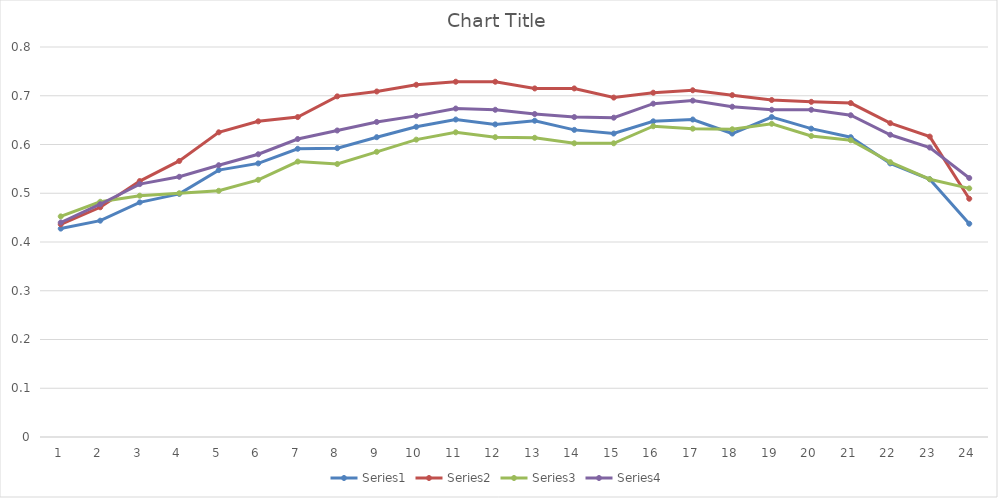
| Category | Series 0 | Series 1 | Series 2 | Series 3 |
|---|---|---|---|---|
| 0 | 0.428 | 0.436 | 0.452 | 0.44 |
| 1 | 0.444 | 0.471 | 0.483 | 0.478 |
| 2 | 0.481 | 0.525 | 0.495 | 0.519 |
| 3 | 0.499 | 0.566 | 0.5 | 0.534 |
| 4 | 0.548 | 0.625 | 0.505 | 0.558 |
| 5 | 0.561 | 0.648 | 0.528 | 0.58 |
| 6 | 0.591 | 0.656 | 0.565 | 0.611 |
| 7 | 0.592 | 0.699 | 0.56 | 0.629 |
| 8 | 0.615 | 0.709 | 0.585 | 0.646 |
| 9 | 0.636 | 0.723 | 0.61 | 0.659 |
| 10 | 0.651 | 0.729 | 0.625 | 0.674 |
| 11 | 0.641 | 0.729 | 0.615 | 0.671 |
| 12 | 0.649 | 0.715 | 0.614 | 0.663 |
| 13 | 0.63 | 0.715 | 0.602 | 0.656 |
| 14 | 0.622 | 0.696 | 0.602 | 0.655 |
| 15 | 0.648 | 0.706 | 0.638 | 0.684 |
| 16 | 0.651 | 0.711 | 0.632 | 0.69 |
| 17 | 0.622 | 0.701 | 0.631 | 0.678 |
| 18 | 0.656 | 0.691 | 0.642 | 0.671 |
| 19 | 0.633 | 0.688 | 0.617 | 0.671 |
| 20 | 0.615 | 0.685 | 0.609 | 0.66 |
| 21 | 0.561 | 0.644 | 0.564 | 0.62 |
| 22 | 0.529 | 0.616 | 0.529 | 0.594 |
| 23 | 0.438 | 0.489 | 0.51 | 0.531 |